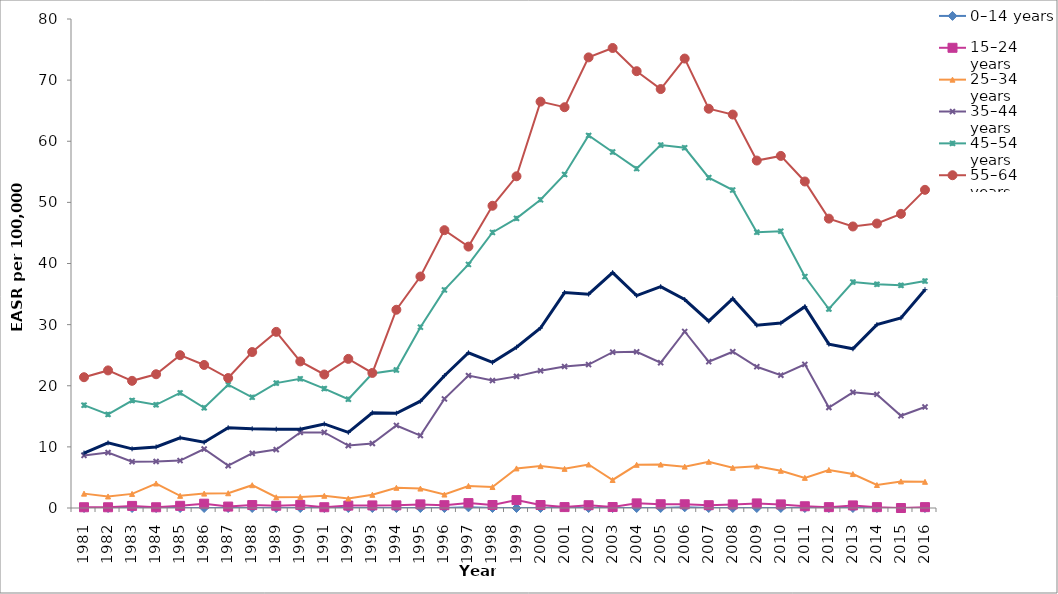
| Category | 0–14 years | 15–24 years | 25–34 years | 35–44 years | 45–54 years | 55–64 years | 65+ years |
|---|---|---|---|---|---|---|---|
| 1981.0 | 0 | 0.124 | 2.351 | 8.593 | 16.821 | 21.397 | 8.993 |
| 1982.0 | 0 | 0.121 | 1.888 | 9.071 | 15.31 | 22.508 | 10.661 |
| 1983.0 | 0 | 0.342 | 2.308 | 7.58 | 17.58 | 20.804 | 9.679 |
| 1984.0 | 0 | 0.121 | 4.01 | 7.611 | 16.88 | 21.882 | 9.99 |
| 1985.0 | 0 | 0.356 | 1.99 | 7.764 | 18.832 | 25 | 11.49 |
| 1986.0 | 0 | 0.704 | 2.357 | 9.649 | 16.396 | 23.401 | 10.757 |
| 1987.0 | 0 | 0.233 | 2.412 | 6.922 | 20.172 | 21.26 | 13.133 |
| 1988.0 | 0 | 0.483 | 3.731 | 8.943 | 18.116 | 25.514 | 12.965 |
| 1989.0 | 0 | 0.372 | 1.76 | 9.556 | 20.428 | 28.816 | 12.895 |
| 1990.0 | 0 | 0.504 | 1.815 | 12.365 | 21.141 | 23.982 | 12.892 |
| 1991.0 | 0 | 0.127 | 2.001 | 12.371 | 19.537 | 21.842 | 13.753 |
| 1992.0 | 0 | 0.392 | 1.561 | 10.212 | 17.797 | 24.397 | 12.379 |
| 1993.0 | 0 | 0.424 | 2.159 | 10.557 | 22.007 | 22.097 | 15.579 |
| 1994.0 | 0 | 0.434 | 3.301 | 13.503 | 22.582 | 32.431 | 15.502 |
| 1995.0 | 0 | 0.592 | 3.179 | 11.852 | 29.586 | 37.869 | 17.477 |
| 1996.0 | 0 | 0.46 | 2.202 | 17.851 | 35.675 | 45.454 | 21.644 |
| 1997.0 | 0.105 | 0.802 | 3.607 | 21.663 | 39.855 | 42.764 | 25.396 |
| 1998.0 | 0 | 0.488 | 3.432 | 20.86 | 45.085 | 49.445 | 23.822 |
| 1999.0 | 0 | 1.297 | 6.475 | 21.536 | 47.38 | 54.269 | 26.304 |
| 2000.0 | 0 | 0.488 | 6.851 | 22.454 | 50.433 | 66.484 | 29.443 |
| 2001.0 | 0.109 | 0.148 | 6.405 | 23.146 | 54.564 | 65.569 | 35.248 |
| 2002.0 | 0 | 0.457 | 7.118 | 23.473 | 60.94 | 73.722 | 34.989 |
| 2003.0 | 0 | 0.159 | 4.586 | 25.489 | 58.246 | 75.257 | 38.507 |
| 2004.0 | 0 | 0.759 | 7.066 | 25.544 | 55.52 | 71.462 | 34.756 |
| 2005.0 | 0 | 0.617 | 7.113 | 23.772 | 59.373 | 68.537 | 36.209 |
| 2006.0 | 0.113 | 0.613 | 6.769 | 28.875 | 58.934 | 73.528 | 34.106 |
| 2007.0 | 0 | 0.46 | 7.565 | 23.932 | 54.051 | 65.317 | 30.577 |
| 2008.0 | 0 | 0.59 | 6.581 | 25.567 | 52.022 | 64.37 | 34.239 |
| 2009.0 | 0 | 0.751 | 6.822 | 23.113 | 45.115 | 56.841 | 29.911 |
| 2010.0 | 0 | 0.589 | 6.091 | 21.722 | 45.276 | 57.602 | 30.248 |
| 2011.0 | 0 | 0.284 | 4.934 | 23.501 | 37.859 | 53.418 | 32.939 |
| 2012.0 | 0 | 0.141 | 6.22 | 16.442 | 32.554 | 47.341 | 26.81 |
| 2013.0 | 0 | 0.423 | 5.552 | 18.929 | 36.961 | 46.058 | 26.047 |
| 2014.0 | 0 | 0.141 | 3.761 | 18.585 | 36.604 | 46.538 | 30.006 |
| 2015.0 | 0 | 0 | 4.347 | 15.09 | 36.432 | 48.124 | 31.097 |
| 2016.0 | 0 | 0.143 | 4.285 | 16.534 | 37.129 | 52.05 | 35.715 |